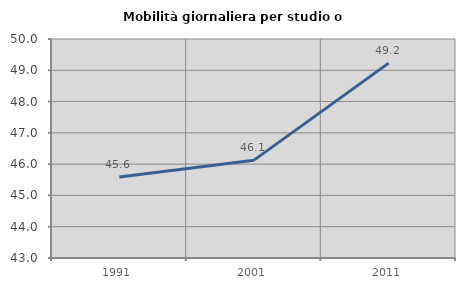
| Category | Mobilità giornaliera per studio o lavoro |
|---|---|
| 1991.0 | 45.586 |
| 2001.0 | 46.128 |
| 2011.0 | 49.229 |